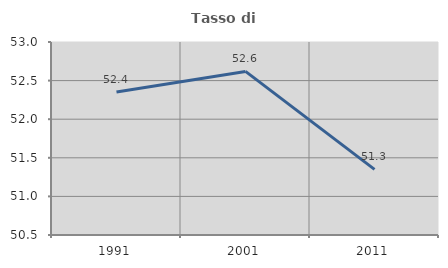
| Category | Tasso di occupazione   |
|---|---|
| 1991.0 | 52.352 |
| 2001.0 | 52.619 |
| 2011.0 | 51.35 |